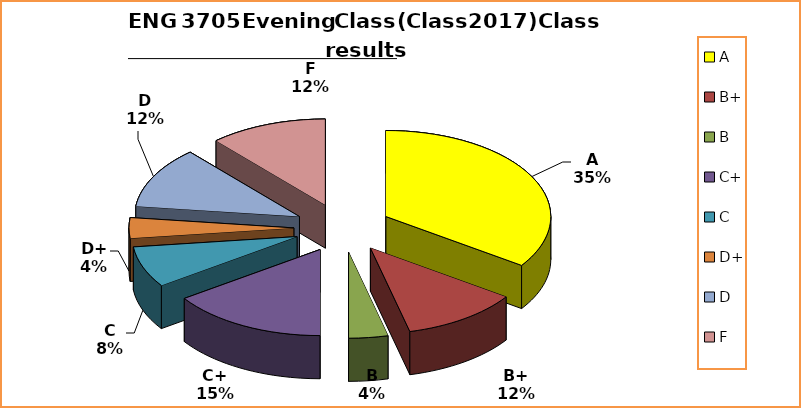
| Category | Series 0 |
|---|---|
| A | 9 |
| B+ | 3 |
| B | 1 |
| C+ | 4 |
| C | 2 |
| D+ | 1 |
| D | 3 |
| F | 3 |